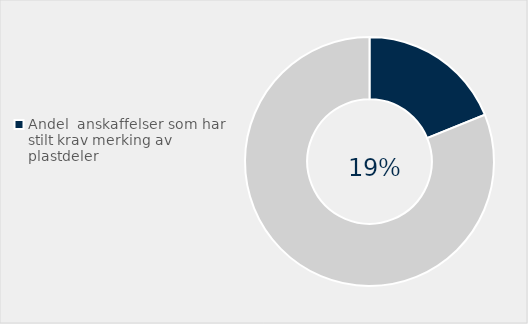
| Category | Series 0 |
|---|---|
| Andel  anskaffelser som har stilt krav merking av plastdeler | 0.189 |
| Ikke stilt krav | 0.811 |